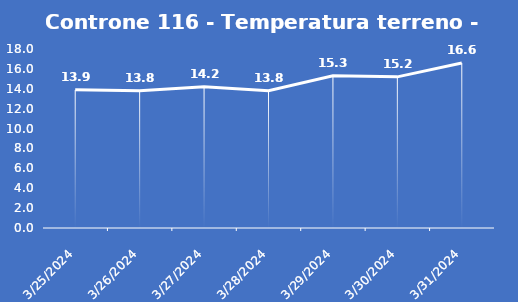
| Category | Controne 116 - Temperatura terreno - Grezzo (°C) |
|---|---|
| 3/25/24 | 13.9 |
| 3/26/24 | 13.8 |
| 3/27/24 | 14.2 |
| 3/28/24 | 13.8 |
| 3/29/24 | 15.3 |
| 3/30/24 | 15.2 |
| 3/31/24 | 16.6 |